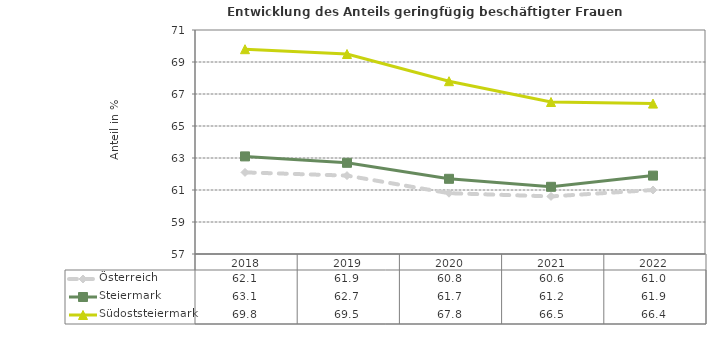
| Category | Österreich | Steiermark | Südoststeiermark |
|---|---|---|---|
| 2022.0 | 61 | 61.9 | 66.4 |
| 2021.0 | 60.6 | 61.2 | 66.5 |
| 2020.0 | 60.8 | 61.7 | 67.8 |
| 2019.0 | 61.9 | 62.7 | 69.5 |
| 2018.0 | 62.1 | 63.1 | 69.8 |